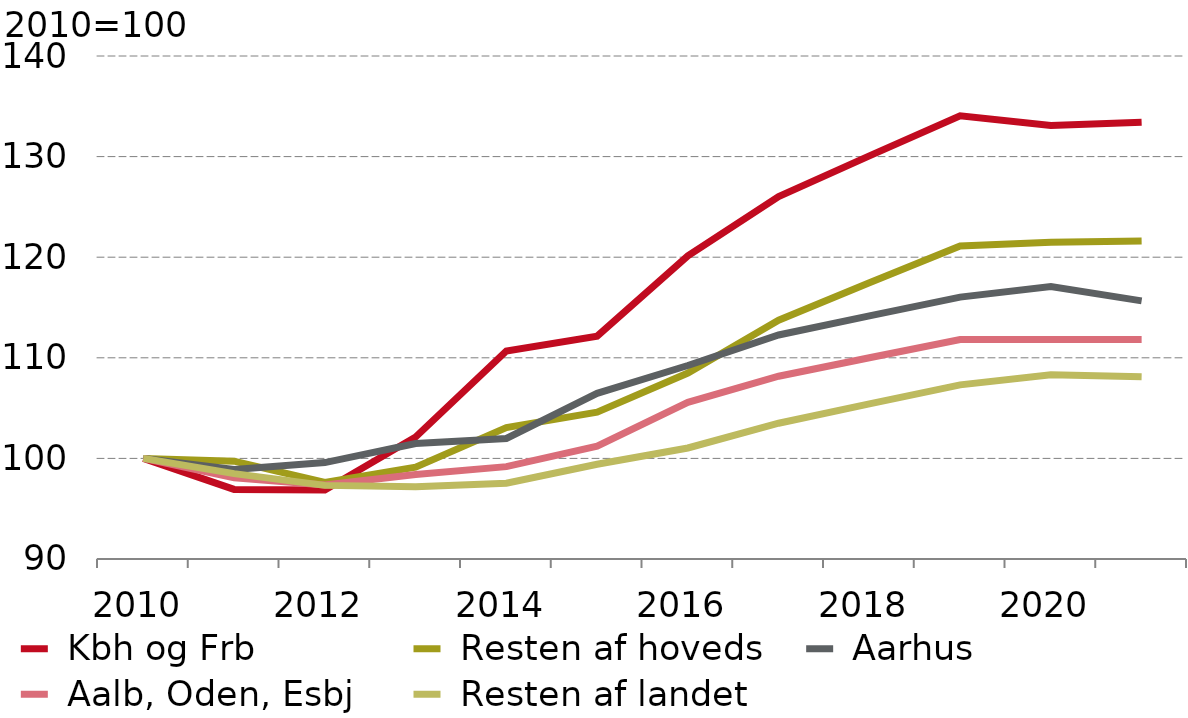
| Category |  Kbh og Frb |  Resten af hoveds |  Aarhus |  Aalb, Oden, Esbj |  Resten af landet |
|---|---|---|---|---|---|
| 2010.0 | 100 | 100 | 100 | 100 | 100 |
| nan | 96.917 | 99.725 | 98.891 | 98.064 | 98.488 |
| 2012.0 | 96.861 | 97.619 | 99.586 | 97.368 | 97.318 |
| nan | 102.123 | 99.129 | 101.473 | 98.395 | 97.191 |
| 2014.0 | 110.669 | 103.067 | 101.979 | 99.181 | 97.527 |
| nan | 112.143 | 104.6 | 106.464 | 101.223 | 99.416 |
| 2016.0 | 120.142 | 108.484 | 109.234 | 105.567 | 101.036 |
| nan | 126.02 | 113.74 | 112.269 | 108.166 | 103.495 |
| 2018.0 | 130.074 | 117.464 | 114.168 | 110.006 | 105.419 |
| nan | 134.059 | 121.124 | 116.035 | 111.814 | 107.309 |
| 2020.0 | 133.096 | 121.489 | 117.078 | 111.815 | 108.305 |
| nan | 133.409 | 121.621 | 115.661 | 111.819 | 108.118 |